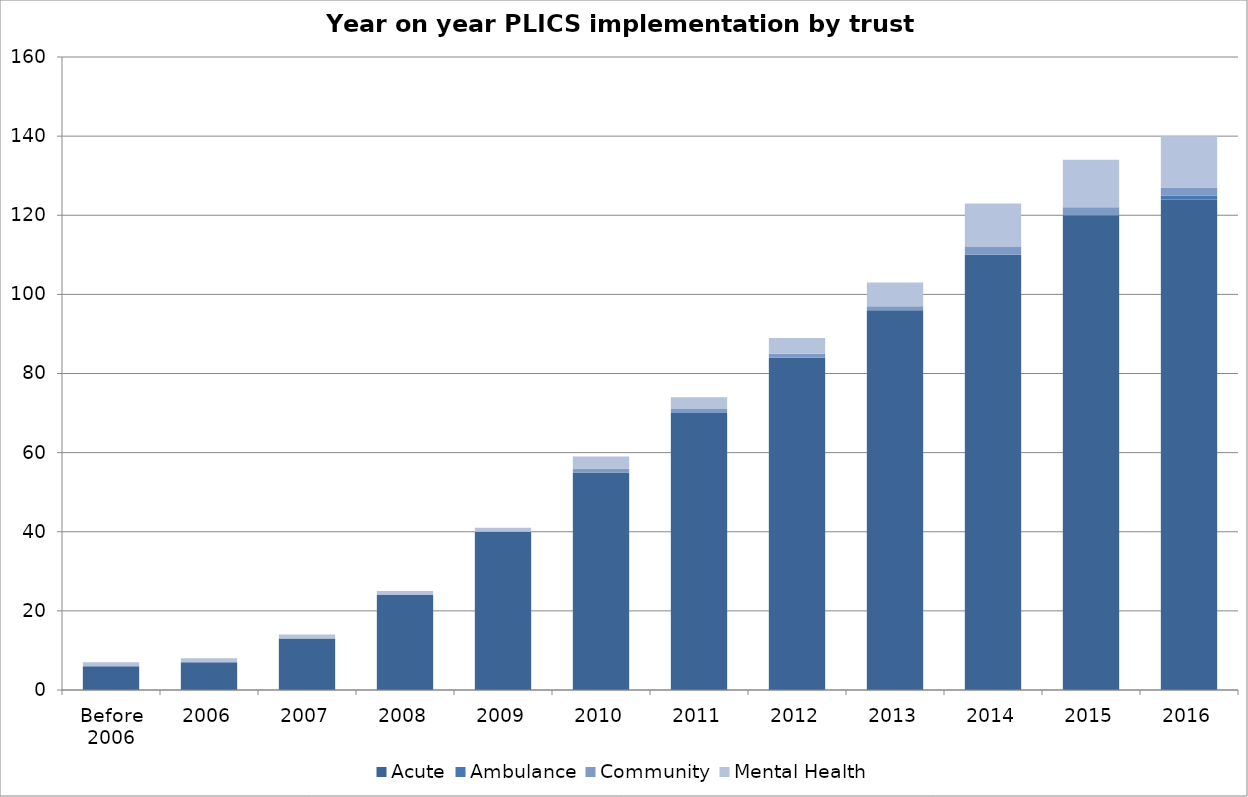
| Category | Acute | Ambulance | Community | Mental Health |
|---|---|---|---|---|
| Before 2006 | 6 | 0 | 0 | 1 |
| 2006 | 7 | 0 | 0 | 1 |
| 2007 | 13 | 0 | 0 | 1 |
| 2008 | 24 | 0 | 0 | 1 |
| 2009 | 40 | 0 | 0 | 1 |
| 2010 | 55 | 0 | 1 | 3 |
| 2011 | 70 | 0 | 1 | 3 |
| 2012 | 84 | 0 | 1 | 4 |
| 2013 | 96 | 0 | 1 | 6 |
| 2014 | 110 | 0 | 2 | 11 |
| 2015 | 120 | 0 | 2 | 12 |
| 2016 | 124 | 1 | 2 | 13 |